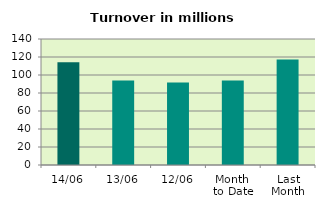
| Category | Series 0 |
|---|---|
| 14/06 | 114.137 |
| 13/06 | 93.877 |
| 12/06 | 91.66 |
| Month 
to Date | 93.97 |
| Last
Month | 117.306 |